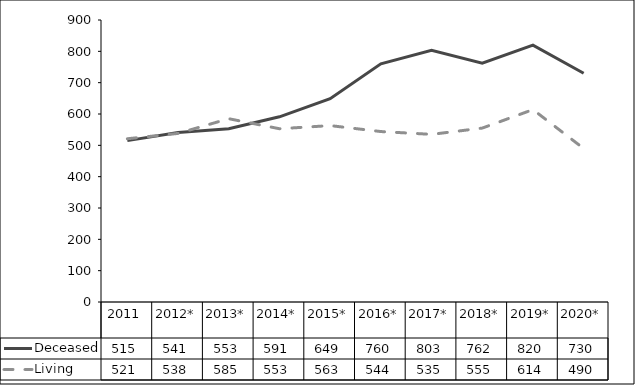
| Category | Deceased | Living |
|---|---|---|
| 2011 | 515 | 521 |
| 2012* | 541 | 538 |
| 2013* | 553 | 585 |
| 2014* | 591 | 553 |
| 2015* | 649 | 563 |
| 2016* | 760 | 544 |
| 2017* | 803 | 535 |
| 2018* | 762 | 555 |
| 2019* | 820 | 614 |
| 2020* | 730 | 490 |